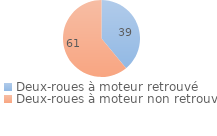
| Category | Series 0 |
|---|---|
| Deux-roues à moteur retrouvé | 38.985 |
| Deux-roues à moteur non retrouvé | 61.015 |